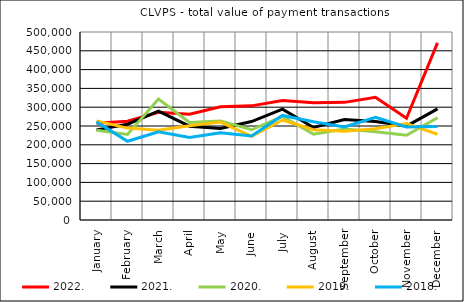
| Category | 2022. | 2021. | 2020. | 2019. | 2018. |
|---|---|---|---|---|---|
| January | 257301.045 | 239737.072 | 238791.39 | 263579.124 | 260982.574 |
| February | 262611.606 | 254737.007 | 227555.463 | 244414.145 | 209434.706 |
| March | 286535.336 | 289434.699 | 321959.709 | 238999.827 | 234774.619 |
| April | 281318.148 | 249545.188 | 259638.022 | 250874.591 | 219520.498 |
| May | 301132.917 | 243297.103 | 263506.422 | 260536.495 | 232314.994 |
| June | 303566.428 | 261740.299 | 240013.078 | 222265.468 | 223508.365 |
| July | 317553.864 | 294783.843 | 275562.72 | 265953.941 | 278130.033 |
| August | 311890.505 | 246102.244 | 227970.798 | 239889.373 | 261384.496 |
| September | 312858.852 | 267078.842 | 242209.109 | 236199.197 | 247615.282 |
| October | 326381.503 | 261859.425 | 234651.085 | 242449.519 | 273283.323 |
| November | 270483.669 | 249717.675 | 225226.454 | 256441.574 | 247537.617 |
| December | 471010.315 | 295438.856 | 272001.5 | 228160.913 | 248820.584 |